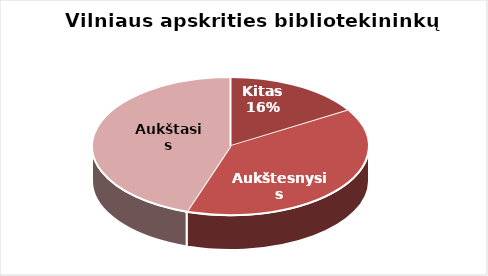
| Category | Series 0 |
|---|---|
| Kitas | 64 |
| Aukštesnysis | 152 |
| Aukštasis | 176 |